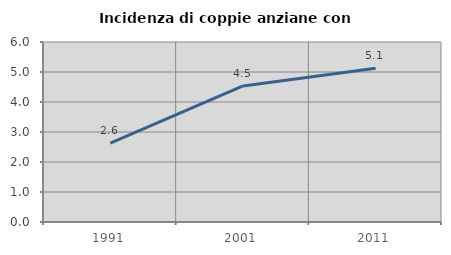
| Category | Incidenza di coppie anziane con figli |
|---|---|
| 1991.0 | 2.632 |
| 2001.0 | 4.534 |
| 2011.0 | 5.122 |